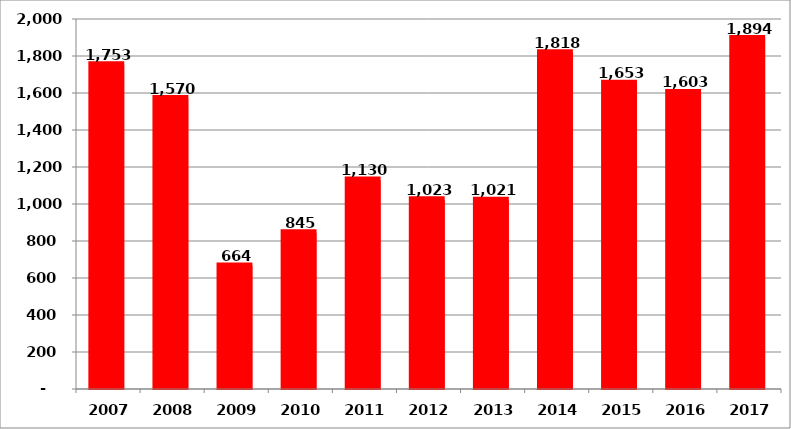
| Category | სულ |
|---|---|
| 2007.0 | 1752.646 |
| 2008.0 | 1569.723 |
| 2009.0 | 664.191 |
| 2010.0 | 845.114 |
| 2011.0 | 1130.263 |
| 2012.0 | 1022.928 |
| 2013.0 | 1020.634 |
| 2014.0 | 1817.981 |
| 2015.0 | 1652.508 |
| 2016.0 | 1602.851 |
| 2017.0 | 1894.491 |